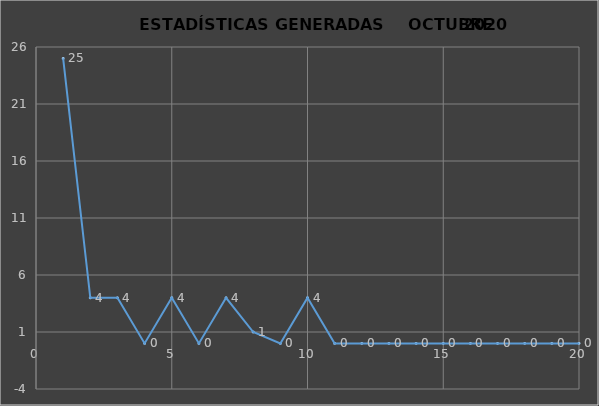
| Category |                   ESTADÍSTICAS GENERADAS     PERÍODO OCTUBRE 2020 CANTIDAD |
|---|---|
| 0 | 25 |
| 1 | 4 |
| 2 | 4 |
| 3 | 0 |
| 4 | 4 |
| 5 | 0 |
| 6 | 4 |
| 7 | 1 |
| 8 | 0 |
| 9 | 4 |
| 10 | 0 |
| 11 | 0 |
| 12 | 0 |
| 13 | 0 |
| 14 | 0 |
| 15 | 0 |
| 16 | 0 |
| 17 | 0 |
| 18 | 0 |
| 19 | 0 |